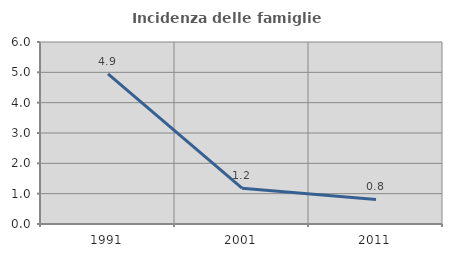
| Category | Incidenza delle famiglie numerose |
|---|---|
| 1991.0 | 4.946 |
| 2001.0 | 1.182 |
| 2011.0 | 0.808 |